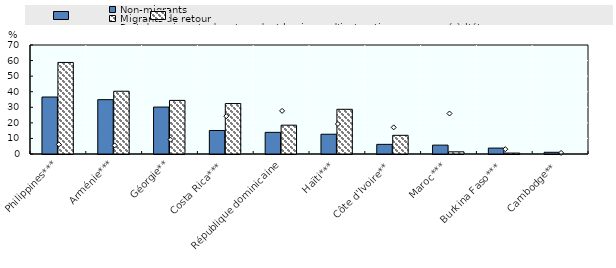
| Category | Non-migrants | Migrants de retour |
|---|---|---|
| Philippines*** | 36.6 | 58.8 |
| Arménie*** | 34.9 | 40.3 |
| Géorgie** | 30.14 | 34.42 |
| Costa Rica*** | 15.1 | 32.4 |
| République dominicaine | 13.9 | 18.5 |
| Haïti*** | 12.7 | 28.7 |
| Côte d'Ivoire** | 6.2 | 12 |
| Maroc*** | 5.7 | 1.4 |
| Burkina Faso*** | 3.8 | 0.6 |
| Cambodge** | 1.1 | 0 |